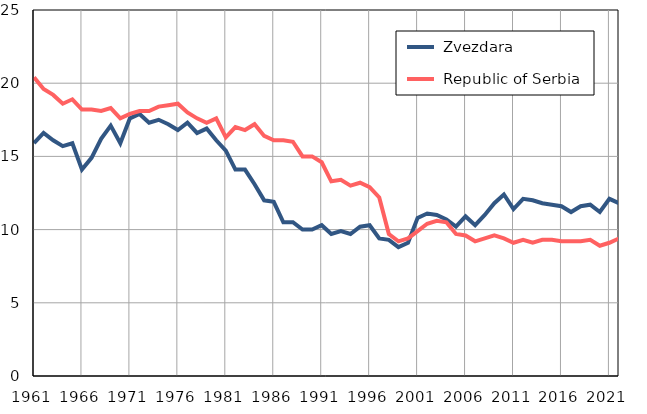
| Category |  Zvezdara |  Republic of Serbia |
|---|---|---|
| 1961.0 | 15.9 | 20.4 |
| 1962.0 | 16.6 | 19.6 |
| 1963.0 | 16.1 | 19.2 |
| 1964.0 | 15.7 | 18.6 |
| 1965.0 | 15.9 | 18.9 |
| 1966.0 | 14.1 | 18.2 |
| 1967.0 | 14.9 | 18.2 |
| 1968.0 | 16.2 | 18.1 |
| 1969.0 | 17.1 | 18.3 |
| 1970.0 | 15.9 | 17.6 |
| 1971.0 | 17.6 | 17.9 |
| 1972.0 | 17.9 | 18.1 |
| 1973.0 | 17.3 | 18.1 |
| 1974.0 | 17.5 | 18.4 |
| 1975.0 | 17.2 | 18.5 |
| 1976.0 | 16.8 | 18.6 |
| 1977.0 | 17.3 | 18 |
| 1978.0 | 16.6 | 17.6 |
| 1979.0 | 16.9 | 17.3 |
| 1980.0 | 16.1 | 17.6 |
| 1981.0 | 15.4 | 16.3 |
| 1982.0 | 14.1 | 17 |
| 1983.0 | 14.1 | 16.8 |
| 1984.0 | 13.1 | 17.2 |
| 1985.0 | 12 | 16.4 |
| 1986.0 | 11.9 | 16.1 |
| 1987.0 | 10.5 | 16.1 |
| 1988.0 | 10.5 | 16 |
| 1989.0 | 10 | 15 |
| 1990.0 | 10 | 15 |
| 1991.0 | 10.3 | 14.6 |
| 1992.0 | 9.7 | 13.3 |
| 1993.0 | 9.9 | 13.4 |
| 1994.0 | 9.7 | 13 |
| 1995.0 | 10.2 | 13.2 |
| 1996.0 | 10.3 | 12.9 |
| 1997.0 | 9.4 | 12.2 |
| 1998.0 | 9.3 | 9.7 |
| 1999.0 | 8.8 | 9.2 |
| 2000.0 | 9.1 | 9.4 |
| 2001.0 | 10.8 | 9.9 |
| 2002.0 | 11.1 | 10.4 |
| 2003.0 | 11 | 10.6 |
| 2004.0 | 10.7 | 10.5 |
| 2005.0 | 10.2 | 9.7 |
| 2006.0 | 10.9 | 9.6 |
| 2007.0 | 10.3 | 9.2 |
| 2008.0 | 11 | 9.4 |
| 2009.0 | 11.8 | 9.6 |
| 2010.0 | 12.4 | 9.4 |
| 2011.0 | 11.4 | 9.1 |
| 2012.0 | 12.1 | 9.3 |
| 2013.0 | 12 | 9.1 |
| 2014.0 | 11.8 | 9.3 |
| 2015.0 | 11.7 | 9.3 |
| 2016.0 | 11.6 | 9.2 |
| 2017.0 | 11.2 | 9.2 |
| 2018.0 | 11.6 | 9.2 |
| 2019.0 | 11.7 | 9.3 |
| 2020.0 | 11.2 | 8.9 |
| 2021.0 | 12.1 | 9.1 |
| 2022.0 | 11.8 | 9.4 |